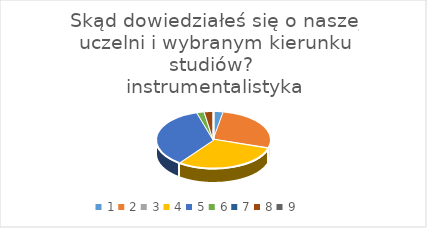
| Category | Series 0 |
|---|---|
| 0 | 8 |
| 1 | 75 |
| 2 | 1 |
| 3 | 84 |
| 4 | 98 |
| 5 | 6 |
| 6 | 0 |
| 7 | 7 |
| 8 | 0 |